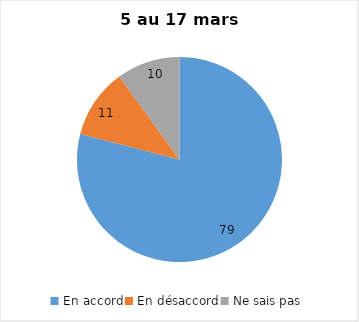
| Category | Series 0 |
|---|---|
| En accord | 79 |
| En désaccord | 11 |
| Ne sais pas | 10 |